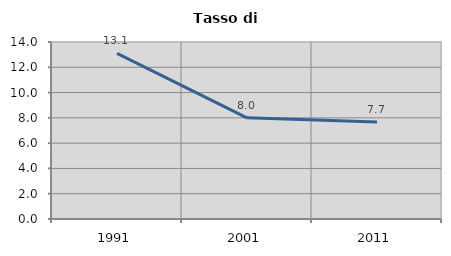
| Category | Tasso di disoccupazione   |
|---|---|
| 1991.0 | 13.105 |
| 2001.0 | 8.002 |
| 2011.0 | 7.668 |